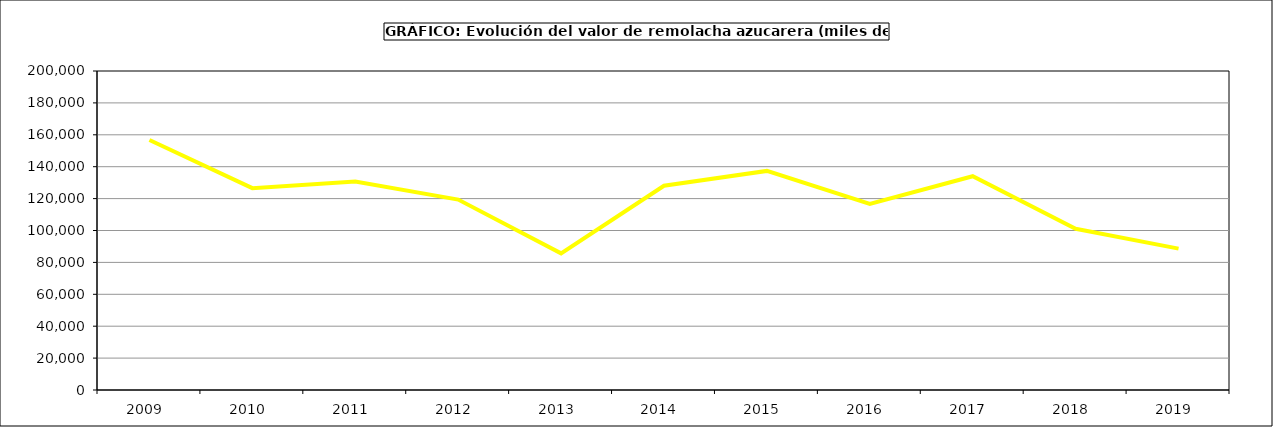
| Category | Valor |
|---|---|
| 2009.0 | 156763.564 |
| 2010.0 | 126535.709 |
| 2011.0 | 130682.292 |
| 2012.0 | 119377.935 |
| 2013.0 | 85662.388 |
| 2014.0 | 128081.83 |
| 2015.0 | 137355 |
| 2016.0 | 116654 |
| 2017.0 | 134014.925 |
| 2018.0 | 101055.926 |
| 2019.0 | 88637.133 |